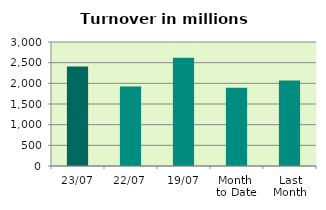
| Category | Series 0 |
|---|---|
| 23/07 | 2404.957 |
| 22/07 | 1924.454 |
| 19/07 | 2621.412 |
| Month 
to Date | 1890.316 |
| Last
Month | 2071.376 |